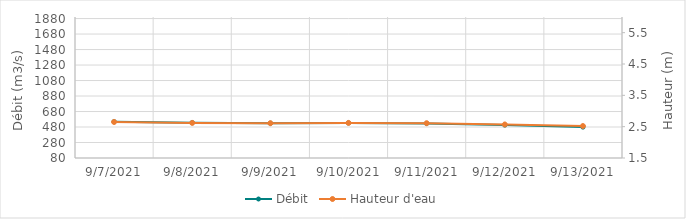
| Category | Débit |
|---|---|
| 6/6/21 | 1674.93 |
| 6/5/21 | 1687.97 |
| 6/4/21 | 1713.04 |
| 6/3/21 | 1706.09 |
| 6/2/21 | 1680.92 |
| 6/1/21 | 1617.33 |
| 5/31/21 | 1491.54 |